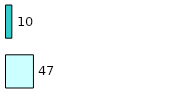
| Category | Series 0 | Series 1 |
|---|---|---|
| 0 | 47 | 10 |